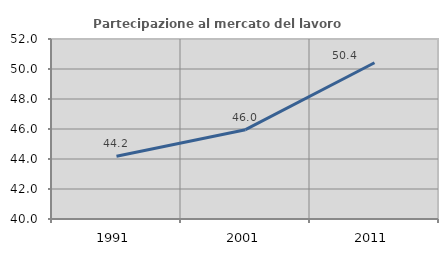
| Category | Partecipazione al mercato del lavoro  femminile |
|---|---|
| 1991.0 | 44.183 |
| 2001.0 | 45.955 |
| 2011.0 | 50.417 |